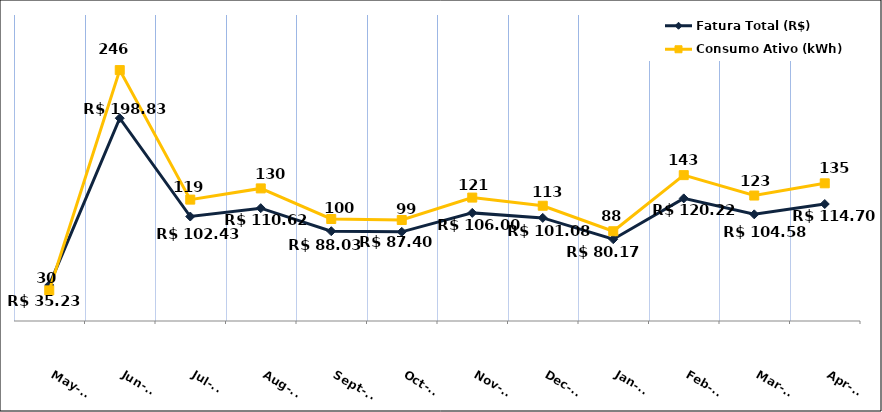
| Category | Fatura Total (R$) |
|---|---|
| 2023-05-01 | 35.23 |
| 2023-06-01 | 198.83 |
| 2023-07-01 | 102.43 |
| 2023-08-01 | 110.62 |
| 2023-09-01 | 88.03 |
| 2023-10-01 | 87.4 |
| 2023-11-01 | 106 |
| 2023-12-01 | 101.08 |
| 2024-01-01 | 80.17 |
| 2024-02-01 | 120.22 |
| 2024-03-01 | 104.58 |
| 2024-04-01 | 114.7 |